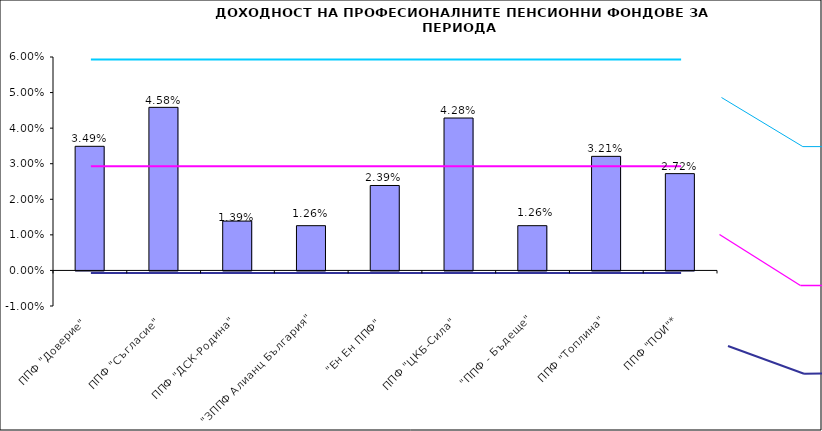
| Category | Series 0 |
|---|---|
| ППФ "Доверие"  | 0.035 |
| ППФ "Съгласие"  | 0.046 |
| ППФ "ДСК-Родина"  | 0.014 |
| "ЗППФ Алианц България"  | 0.013 |
| "Ен Ен ППФ"  | 0.024 |
| ППФ "ЦКБ-Сила"  | 0.043 |
| "ППФ - Бъдеще" | 0.013 |
| ППФ "Топлина" | 0.032 |
| ППФ "ПОИ"* | 0.027 |